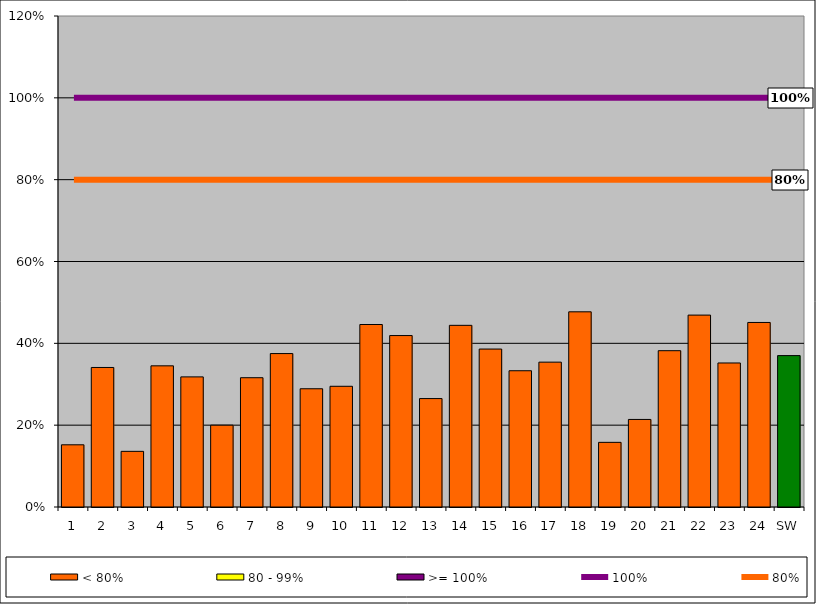
| Category | < 80% | 80 - 99% | >= 100% |
|---|---|---|---|
| 1 | 0.152 | 0 | 0 |
| 2 | 0.341 | 0 | 0 |
| 3 | 0.136 | 0 | 0 |
| 4 | 0.345 | 0 | 0 |
| 5 | 0.318 | 0 | 0 |
| 6 | 0.2 | 0 | 0 |
| 7 | 0.316 | 0 | 0 |
| 8 | 0.375 | 0 | 0 |
| 9 | 0.289 | 0 | 0 |
| 10 | 0.295 | 0 | 0 |
| 11 | 0.446 | 0 | 0 |
| 12 | 0.419 | 0 | 0 |
| 13 | 0.265 | 0 | 0 |
| 14 | 0.444 | 0 | 0 |
| 15 | 0.386 | 0 | 0 |
| 16 | 0.333 | 0 | 0 |
| 17 | 0.354 | 0 | 0 |
| 18 | 0.477 | 0 | 0 |
| 19 | 0.158 | 0 | 0 |
| 20 | 0.214 | 0 | 0 |
| 21 | 0.382 | 0 | 0 |
| 22 | 0.469 | 0 | 0 |
| 23 | 0.352 | 0 | 0 |
| 24 | 0.451 | 0 | 0 |
| SW | 0.37 | 0 | 0 |